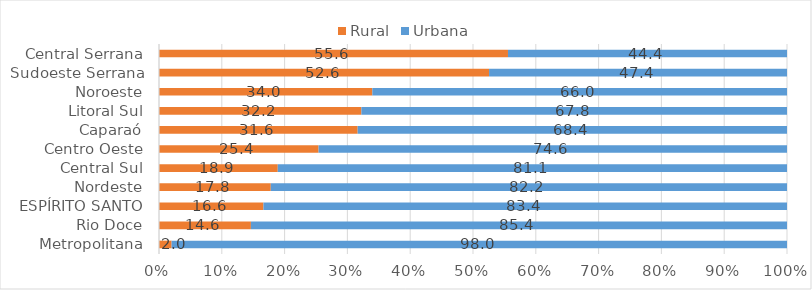
| Category | Rural | Urbana |
|---|---|---|
| Metropolitana | 2.005 | 97.995 |
| Rio Doce | 14.634 | 85.366 |
| ESPÍRITO SANTO | 16.631 | 83.369 |
| Nordeste | 17.799 | 82.201 |
| Central Sul | 18.912 | 81.088 |
| Centro Oeste | 25.41 | 74.59 |
| Caparaó | 31.635 | 68.365 |
| Litoral Sul | 32.222 | 67.778 |
| Noroeste | 33.971 | 66.029 |
| Sudoeste Serrana | 52.558 | 47.442 |
| Central Serrana | 55.57 | 44.43 |